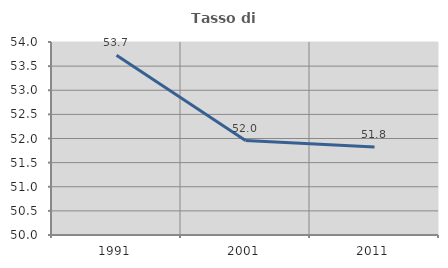
| Category | Tasso di occupazione   |
|---|---|
| 1991.0 | 53.726 |
| 2001.0 | 51.958 |
| 2011.0 | 51.825 |